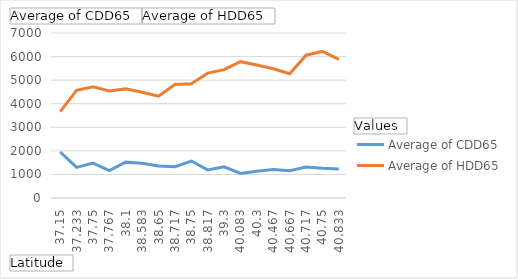
| Category | Average of CDD65 | Average of HDD65 |
|---|---|---|
| 37.15 | 1952 | 3665 |
| 37.233 | 1298 | 4565.5 |
| 37.75 | 1482 | 4715 |
| 37.767 | 1166 | 4543 |
| 38.1 | 1521 | 4629 |
| 38.583 | 1470 | 4487 |
| 38.65 | 1361 | 4321 |
| 38.717 | 1328 | 4818 |
| 38.75 | 1569 | 4843 |
| 38.817 | 1191 | 5297 |
| 39.3 | 1321 | 5444 |
| 40.083 | 1040 | 5783 |
| 40.3 | 1134 | 5644 |
| 40.467 | 1211 | 5483 |
| 40.667 | 1153 | 5270 |
| 40.717 | 1315 | 6058 |
| 40.75 | 1263 | 6220 |
| 40.833 | 1228 | 5882 |